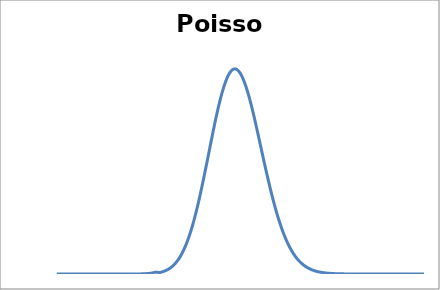
| Category | Poisson |
|---|---|
| 1.0 | 0 |
| 2.0 | 0 |
| 3.0 | 0 |
| 4.0 | 0 |
| 5.0 | 0 |
| 6.0 | 0 |
| 7.0 | 0 |
| 8.0 | 0 |
| 9.0 | 0 |
| 10.0 | 0 |
| 11.0 | 0 |
| 12.0 | 0 |
| 13.0 | 0 |
| 14.0 | 0 |
| 15.0 | 0 |
| 16.0 | 0 |
| 17.0 | 0 |
| 18.0 | 0 |
| 19.0 | 0 |
| 20.0 | 0 |
| 21.0 | 0 |
| 22.0 | 0 |
| 23.0 | 0 |
| 24.0 | 0 |
| 25.0 | 0 |
| 26.0 | 0 |
| 27.0 | 0 |
| 28.0 | 0.001 |
| 29.0 | 0 |
| 30.0 | 0.001 |
| 31.0 | 0.001 |
| 32.0 | 0.002 |
| 33.0 | 0.003 |
| 34.0 | 0.004 |
| 35.0 | 0.005 |
| 36.0 | 0.008 |
| 37.0 | 0.01 |
| 38.0 | 0.013 |
| 39.0 | 0.017 |
| 40.0 | 0.021 |
| 41.0 | 0.026 |
| 42.0 | 0.031 |
| 43.0 | 0.036 |
| 44.0 | 0.041 |
| 45.0 | 0.046 |
| 46.0 | 0.05 |
| 47.0 | 0.053 |
| 48.0 | 0.055 |
| 49.0 | 0.056 |
| 50.0 | 0.056 |
| 51.0 | 0.055 |
| 52.0 | 0.053 |
| 53.0 | 0.05 |
| 54.0 | 0.046 |
| 55.0 | 0.042 |
| 56.0 | 0.038 |
| 57.0 | 0.033 |
| 58.0 | 0.028 |
| 59.0 | 0.024 |
| 60.0 | 0.02 |
| 61.0 | 0.016 |
| 62.0 | 0.013 |
| 63.0 | 0.011 |
| 64.0 | 0.008 |
| 65.0 | 0.006 |
| 66.0 | 0.005 |
| 67.0 | 0.004 |
| 68.0 | 0.003 |
| 69.0 | 0.002 |
| 70.0 | 0.001 |
| 71.0 | 0.001 |
| 72.0 | 0.001 |
| 73.0 | 0 |
| 74.0 | 0 |
| 75.0 | 0 |
| 76.0 | 0 |
| 77.0 | 0 |
| 78.0 | 0 |
| 79.0 | 0 |
| 80.0 | 0 |
| 81.0 | 0 |
| 82.0 | 0 |
| 83.0 | 0 |
| 84.0 | 0 |
| 85.0 | 0 |
| 86.0 | 0 |
| 87.0 | 0 |
| 88.0 | 0 |
| 89.0 | 0 |
| 90.0 | 0 |
| 91.0 | 0 |
| 92.0 | 0 |
| 93.0 | 0 |
| 94.0 | 0 |
| 95.0 | 0 |
| 96.0 | 0 |
| 97.0 | 0 |
| 98.0 | 0 |
| 99.0 | 0 |
| 100.0 | 0 |
| 101.0 | 0 |